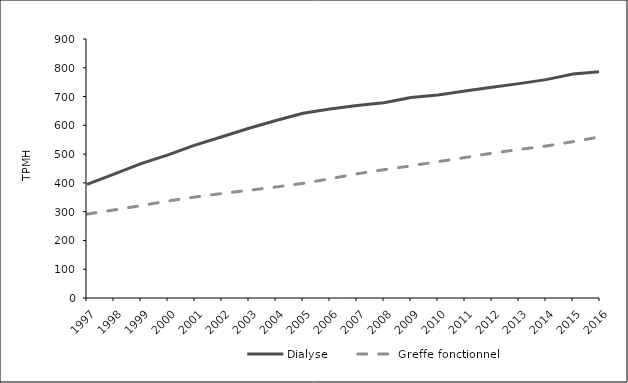
| Category | Dialyse | Greffe fonctionnel |
|---|---|---|
| 1997.0 | 395.1 | 291.5 |
| 1998.0 | 430.5 | 306 |
| 1999.0 | 466.8 | 321.2 |
| 2000.0 | 497.3 | 337 |
| 2001.0 | 531 | 350.8 |
| 2002.0 | 560.5 | 363.2 |
| 2003.0 | 590 | 374.4 |
| 2004.0 | 616.9 | 385.8 |
| 2005.0 | 641.8 | 398.4 |
| 2006.0 | 657.1 | 414.3 |
| 2007.0 | 669.3 | 431.6 |
| 2008.0 | 678.8 | 445.8 |
| 2009.0 | 697 | 459.2 |
| 2010.0 | 705.4 | 473.8 |
| 2011.0 | 719.2 | 488 |
| 2012.0 | 732.3 | 503.3 |
| 2013.0 | 744.9 | 516.3 |
| 2014.0 | 758.8 | 528.1 |
| 2015.0 | 778.5 | 543.3 |
| 2016.0 | 786.3 | 560.1 |